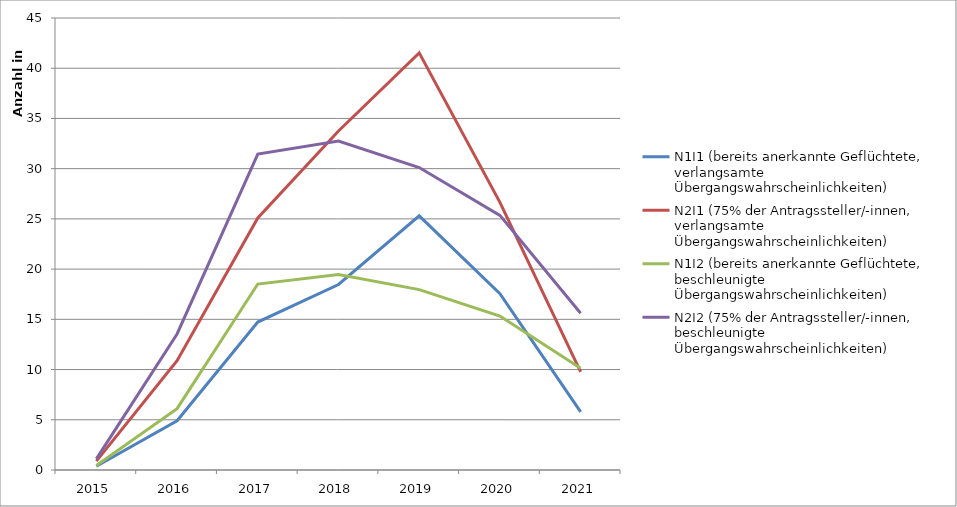
| Category | N1I1 (bereits anerkannte Geflüchtete, verlangsamte Übergangswahrscheinlichkeiten) | N2I1 (75% der Antragssteller/-innen, verlangsamte Übergangswahrscheinlichkeiten) | N1I2 (bereits anerkannte Geflüchtete, beschleunigte Übergangswahrscheinlichkeiten) | N2I2 (75% der Antragssteller/-innen, beschleunigte Übergangswahrscheinlichkeiten) |
|---|---|---|---|---|
| 2015.0 | 368 | 887 | 458 | 1103 |
| 2016.0 | 4900 | 10888 | 6107 | 13542 |
| 2017.0 | 14731 | 25090 | 18512 | 31448 |
| 2018.0 | 18467 | 33753 | 19454 | 32741 |
| 2019.0 | 25300 | 41526 | 17961 | 30112 |
| 2020.0 | 17562 | 26641 | 15327 | 25352 |
| 2021.0 | 5793 | 9766 | 10127 | 15602 |